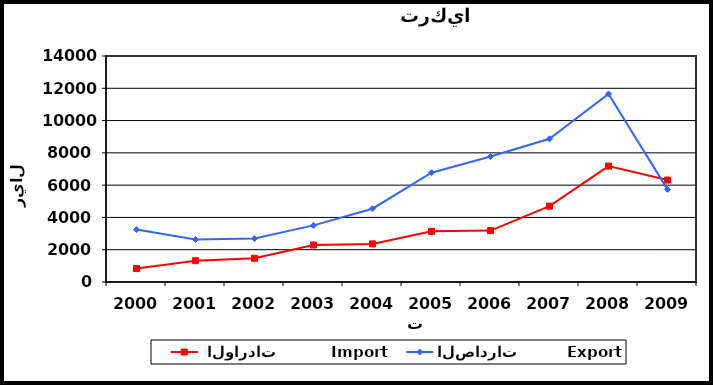
| Category |  الواردات           Import | الصادرات          Export |
|---|---|---|
| 2000.0 | 833 | 3248 |
| 2001.0 | 1319 | 2635 |
| 2002.0 | 1471 | 2689 |
| 2003.0 | 2292 | 3509 |
| 2004.0 | 2360 | 4539 |
| 2005.0 | 3139 | 6769 |
| 2006.0 | 3183 | 7771 |
| 2007.0 | 4699 | 8872 |
| 2008.0 | 7181 | 11650 |
| 2009.0 | 6314 | 5737 |